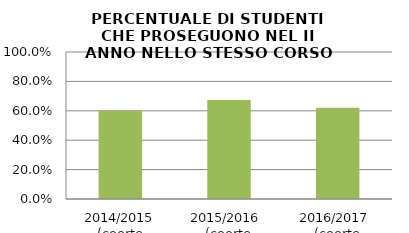
| Category | 2014/2015 (coorte 2013/14) 2015/2016  (coorte 2014/15) 2016/2017  (coorte 2015/16) |
|---|---|
| 2014/2015 (coorte 2013/14) | 0.6 |
| 2015/2016  (coorte 2014/15) | 0.674 |
| 2016/2017  (coorte 2015/16) | 0.621 |